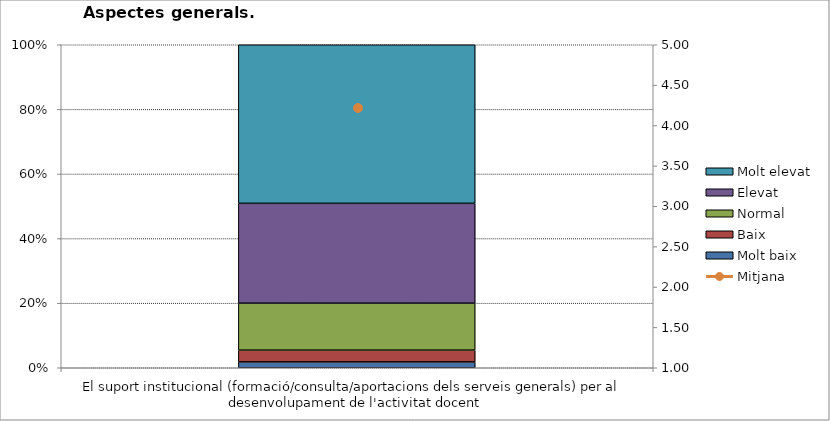
| Category | Molt baix | Baix | Normal  | Elevat | Molt elevat |
|---|---|---|---|---|---|
| El suport institucional (formació/consulta/aportacions dels serveis generals) per al desenvolupament de l'activitat docent | 1 | 2 | 8 | 17 | 27 |